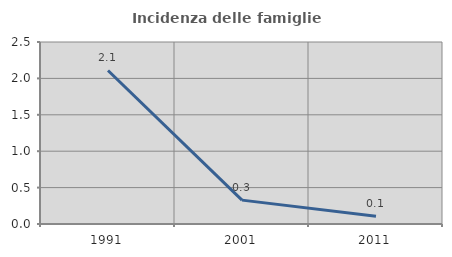
| Category | Incidenza delle famiglie numerose |
|---|---|
| 1991.0 | 2.109 |
| 2001.0 | 0.328 |
| 2011.0 | 0.105 |